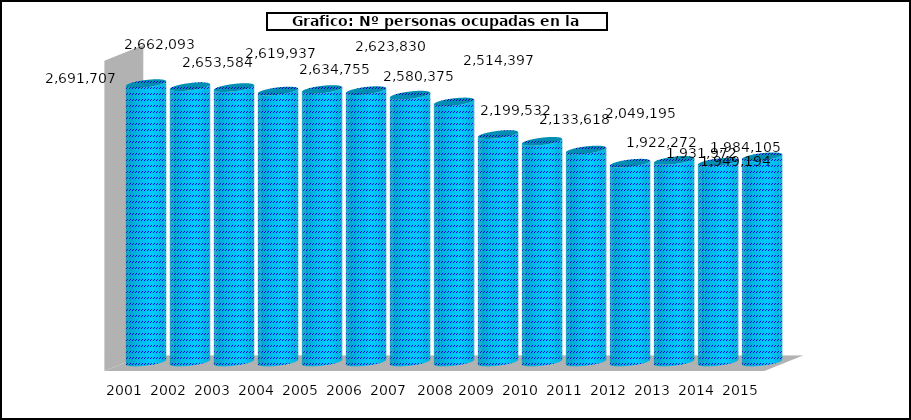
| Category |  Nº personas ocupadas |
|---|---|
| 2001 | 2691707 |
| 2002 | 2662093 |
| 2003 | 2653584 |
| 2004 | 2619937 |
| 2005 | 2634755 |
| 2006 | 2623830 |
| 2007 | 2580375 |
|  2008 * | 2514397 |
| 2009 | 2199532 |
| 2010 | 2133618 |
| 2011 | 2049195 |
| 2012 | 1922272 |
| 2013 | 1949194 |
| 2014 | 1931972 |
| 2015 | 1984105 |